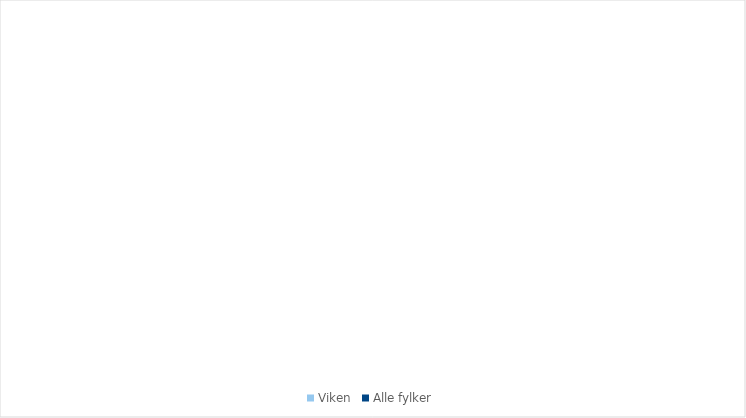
| Category | Viken | Alle fylker |
|---|---|---|
| 1.1 Landbruk | 0.618 | 0.814 |
| 1.2 Fiske/oppdrett | 0 | 1.732 |
| 2.1 Primærforedlingsindustri | 2.461 | 2.443 |
| 2.2 Olje/gass, bergverk | 0.047 | 2.052 |
| 2.3 Teknologiindustri | 2.757 | 1.926 |
| 2.4 Annen industri | 3.606 | 3.764 |
| 3.1 Bygg/anlegg, energi, vann/
avløp, eiendom | 21.839 | 21.135 |
| 3.2 Transport- og distribusjonstjenester | 4.172 | 4.233 |
| 4.1 Kunnskapsintensiv forretningsmessig tjenesteyting (KIFT) | 15.43 | 16.953 |
| 4.2 Varehandel | 13.953 | 9.688 |
| 4.3 Overnatting og servering | 1.667 | 1.718 |
| 4.4 Annen privat dominert tjenesteyting | 5.894 | 5.772 |
| 5.1 Offentlig admistrasjon og forsvar | 7.063 | 8.035 |
| 5.2 Undervisning | 5.979 | 6.39 |
| 5.3 Helse- og omsorgstjenester | 14.513 | 13.343 |